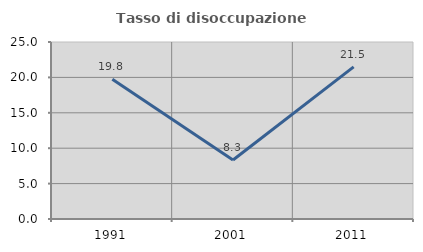
| Category | Tasso di disoccupazione giovanile  |
|---|---|
| 1991.0 | 19.751 |
| 2001.0 | 8.333 |
| 2011.0 | 21.491 |